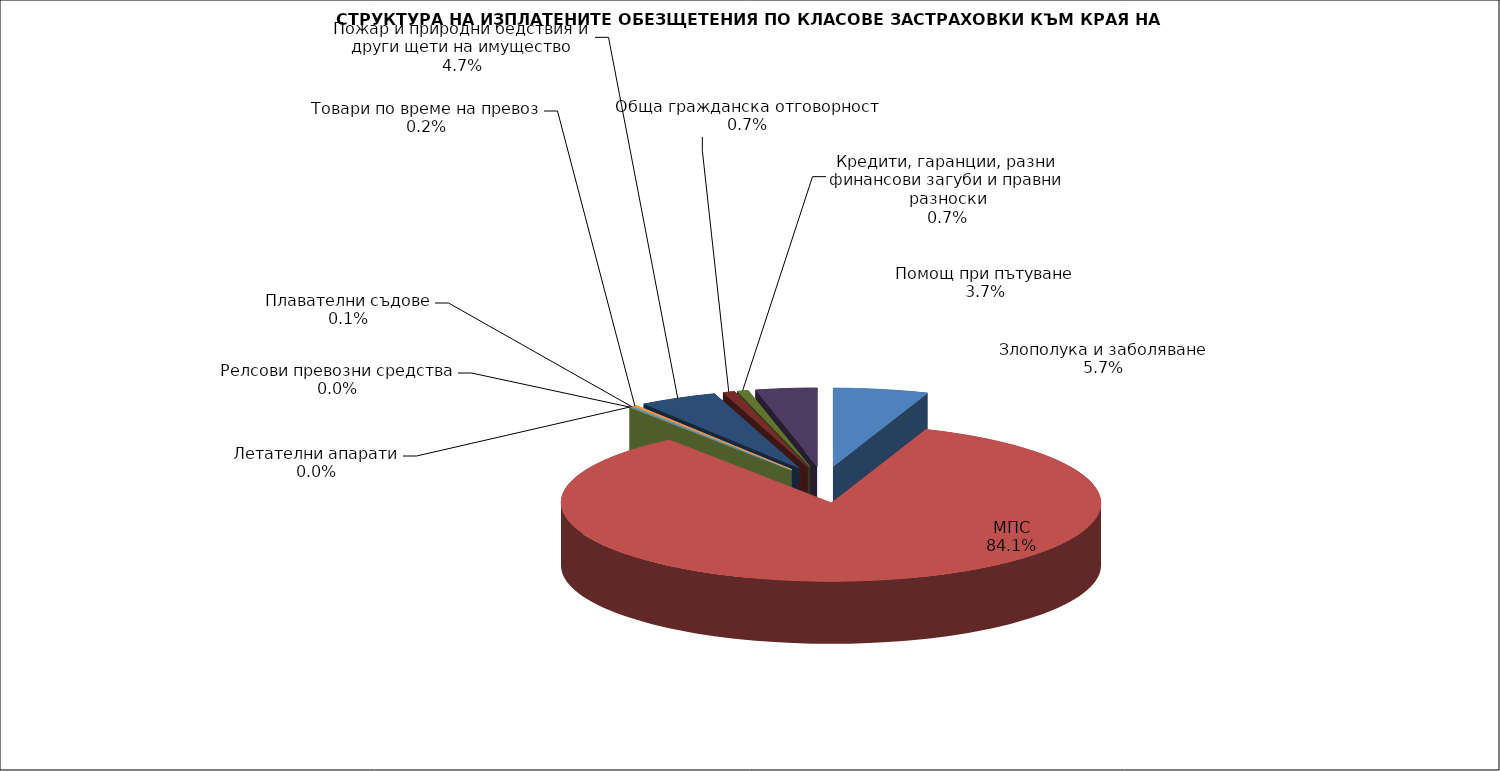
| Category | Злополука и заболяване |
|---|---|
| Злополука и заболяване | 0.057 |
| МПС | 0.841 |
| Релсови превозни средства | 0 |
| Летателни апарати | 0 |
| Плавателни съдове | 0.001 |
| Товари по време на превоз | 0.002 |
| Пожар и природни бедствия и други щети на имущество | 0.047 |
| Обща гражданска отговорност | 0.007 |
| Кредити, гаранции, разни финансови загуби и правни разноски | 0.007 |
| Помощ при пътуване | 0.037 |